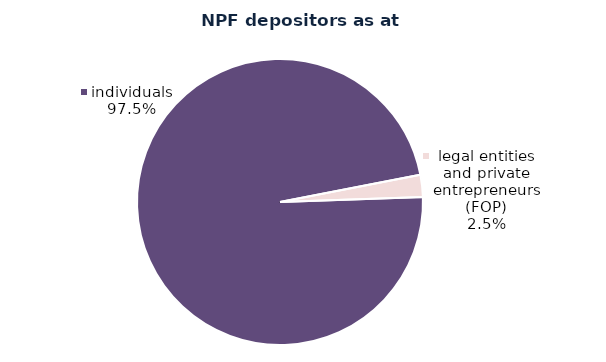
| Category | Series 0 |
|---|---|
| legal entities and private entrepreneurs (FOP) | 2098 |
| individuals | 81611 |